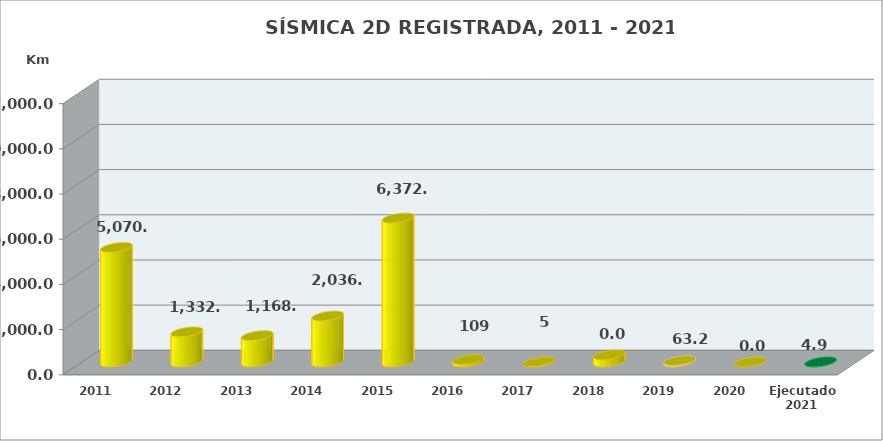
| Category | Series 0 |
|---|---|
| 2011 | 5070.18 |
| 2012 | 1332.85 |
| 2013 | 1168 |
| 2014 | 2036 |
| 2015 | 6372.61 |
| 2016 | 109 |
| 2017 | 4.91 |
| 2018 | 313.4 |
| 2019 | 63.22 |
| 2020 | 0 |
| Ejecutado 2021 | 4.91 |